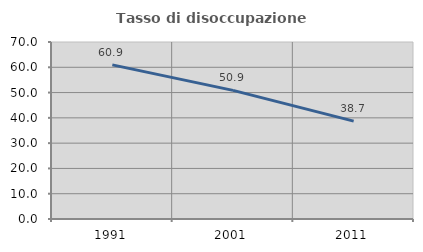
| Category | Tasso di disoccupazione giovanile  |
|---|---|
| 1991.0 | 60.947 |
| 2001.0 | 50.867 |
| 2011.0 | 38.723 |